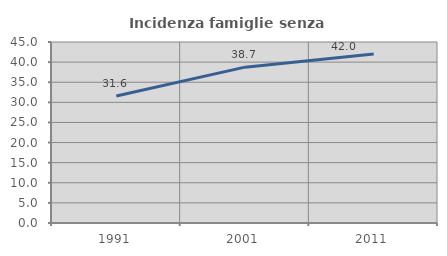
| Category | Incidenza famiglie senza nuclei |
|---|---|
| 1991.0 | 31.596 |
| 2001.0 | 38.745 |
| 2011.0 | 42.023 |